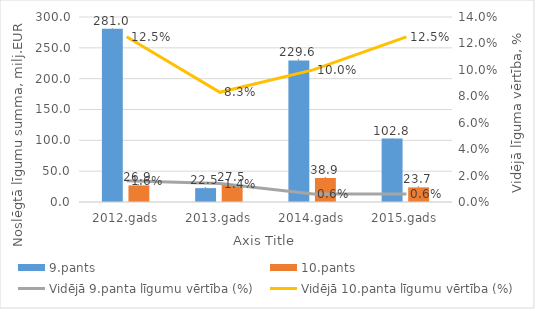
| Category | 9.pants | 10.pants |
|---|---|---|
| 2012.gads | 281 | 26.9 |
| 2013.gads | 22.5 | 27.5 |
| 2014.gads | 229.6 | 38.9 |
| 2015.gads | 102.8 | 23.7 |